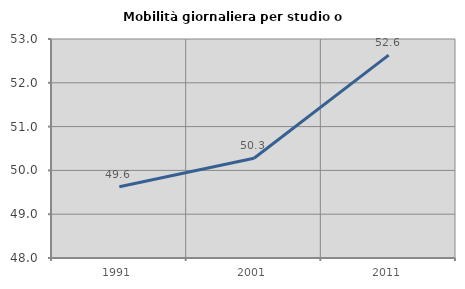
| Category | Mobilità giornaliera per studio o lavoro |
|---|---|
| 1991.0 | 49.627 |
| 2001.0 | 50.278 |
| 2011.0 | 52.632 |